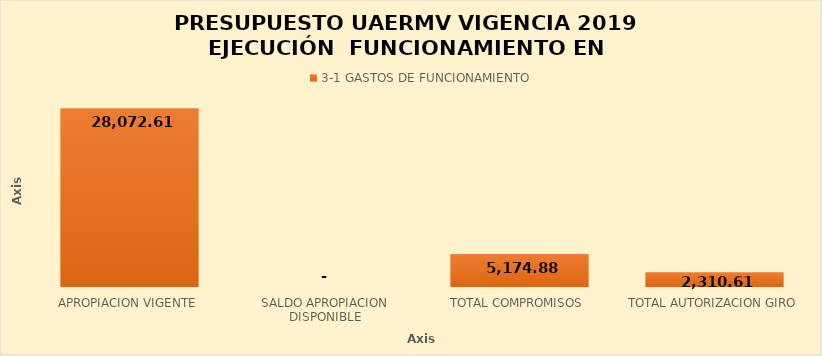
| Category | 3-1 |
|---|---|
| APROPIACION VIGENTE | 28072.61 |
| SALDO APROPIACION DISPONIBLE | 0 |
| TOTAL COMPROMISOS | 5174.885 |
| TOTAL AUTORIZACION GIRO | 2310.607 |